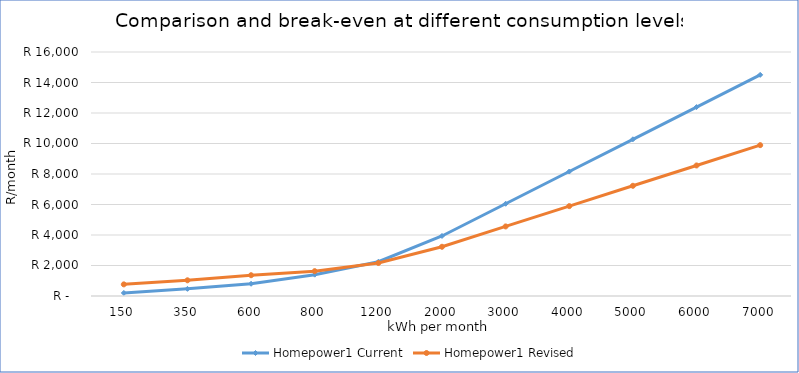
| Category | Homepower1 Current | Homepower1 Revised |
|---|---|---|
| 150.0 | 200.745 | 762.93 |
| 350.0 | 468.405 | 1029.488 |
| 600.0 | 802.98 | 1362.684 |
| 800.0 | 1399.908 | 1629.241 |
| 1200.0 | 2245.188 | 2162.356 |
| 2000.0 | 3935.748 | 3228.584 |
| 3000.0 | 6048.948 | 4561.371 |
| 4000.0 | 8162.148 | 5894.156 |
| 5000.0 | 10275.348 | 7226.942 |
| 6000.0 | 12388.548 | 8559.729 |
| 7000.0 | 14501.748 | 9892.515 |